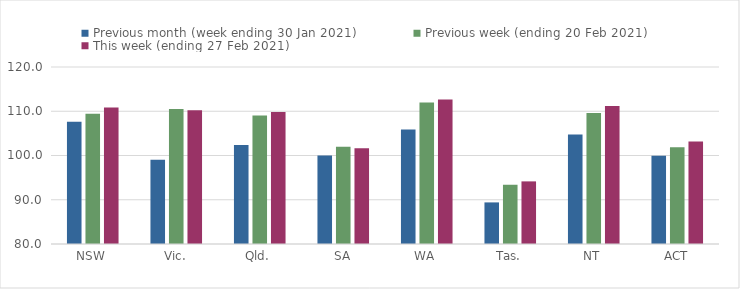
| Category | Previous month (week ending 30 Jan 2021) | Previous week (ending 20 Feb 2021) | This week (ending 27 Feb 2021) |
|---|---|---|---|
| NSW | 107.64 | 109.43 | 110.87 |
| Vic. | 99.05 | 110.49 | 110.21 |
| Qld. | 102.4 | 109.05 | 109.82 |
| SA | 99.99 | 101.97 | 101.65 |
| WA | 105.89 | 111.99 | 112.67 |
| Tas. | 89.4 | 93.39 | 94.15 |
| NT | 104.77 | 109.59 | 111.2 |
| ACT | 99.97 | 101.87 | 103.15 |